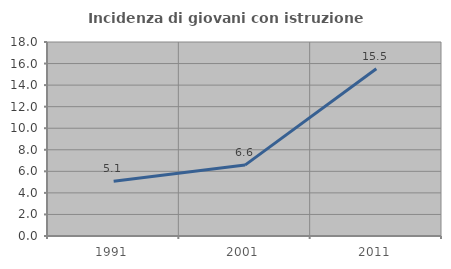
| Category | Incidenza di giovani con istruzione universitaria |
|---|---|
| 1991.0 | 5.085 |
| 2001.0 | 6.579 |
| 2011.0 | 15.517 |